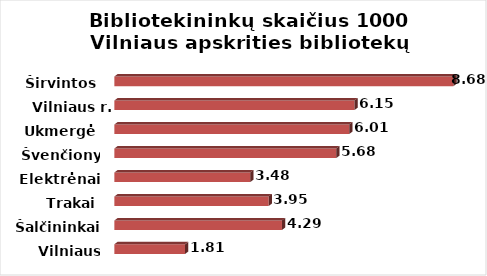
| Category | Series 0 |
|---|---|
| Vilniaus m. | 1.81 |
| Šalčininkai | 4.29 |
| Trakai | 3.95 |
| Elektrėnai | 3.48 |
| Švenčionys | 5.68 |
| Ukmergė | 6.01 |
| Vilniaus r. | 6.146 |
| Širvintos | 8.68 |